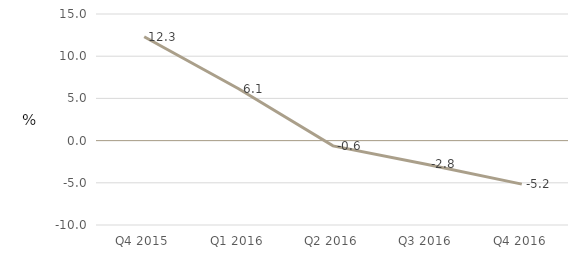
| Category | Public administration and defence;   compulsory social security |
|---|---|
| Q4 2015 | 12.305 |
| Q1 2016 | 6.149 |
| Q2 2016 | -0.626 |
| Q3 2016 | -2.823 |
| Q4 2016 | -5.16 |